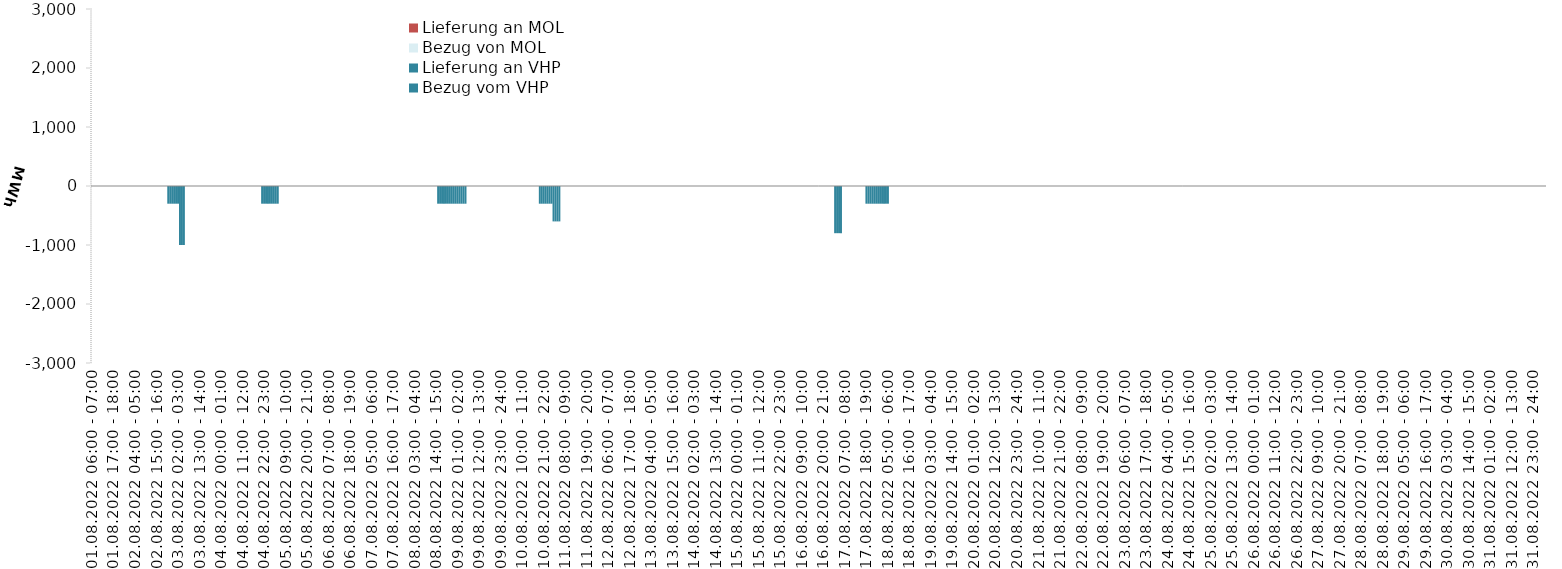
| Category | Bezug vom VHP | Lieferung an VHP | Bezug von MOL | Lieferung an MOL |
|---|---|---|---|---|
| 01.08.2022 06:00 - 07:00 | 0 | 0 | 0 | 0 |
| 01.08.2022 07:00 - 08:00 | 0 | 0 | 0 | 0 |
| 01.08.2022 08:00 - 09:00 | 0 | 0 | 0 | 0 |
| 01.08.2022 09:00 - 10:00 | 0 | 0 | 0 | 0 |
| 01.08.2022 10:00 - 11:00 | 0 | 0 | 0 | 0 |
| 01.08.2022 11:00 - 12:00 | 0 | 0 | 0 | 0 |
| 01.08.2022 12:00 - 13:00 | 0 | 0 | 0 | 0 |
| 01.08.2022 13:00 - 14:00 | 0 | 0 | 0 | 0 |
| 01.08.2022 14:00 - 15:00 | 0 | 0 | 0 | 0 |
| 01.08.2022 15:00 - 16:00 | 0 | 0 | 0 | 0 |
| 01.08.2022 16:00 - 17:00 | 0 | 0 | 0 | 0 |
| 01.08.2022 17:00 - 18:00 | 0 | 0 | 0 | 0 |
| 01.08.2022 18:00 - 19:00 | 0 | 0 | 0 | 0 |
| 01.08.2022 19:00 - 20:00 | 0 | 0 | 0 | 0 |
| 01.08.2022 20:00 - 21:00 | 0 | 0 | 0 | 0 |
| 01.08.2022 21:00 - 22:00 | 0 | 0 | 0 | 0 |
| 01.08.2022 22:00 - 23:00 | 0 | 0 | 0 | 0 |
| 01.08.2022 23:00 - 24:00 | 0 | 0 | 0 | 0 |
| 02.08.2022 00:00 - 01:00 | 0 | 0 | 0 | 0 |
| 02.08.2022 01:00 - 02:00 | 0 | 0 | 0 | 0 |
| 02.08.2022 02:00 - 03:00 | 0 | 0 | 0 | 0 |
| 02.08.2022 03:00 - 04:00 | 0 | 0 | 0 | 0 |
| 02.08.2022 04:00 - 05:00 | 0 | 0 | 0 | 0 |
| 02.08.2022 05:00 - 06:00 | 0 | 0 | 0 | 0 |
| 02.08.2022 06:00 - 07:00 | 0 | 0 | 0 | 0 |
| 02.08.2022 07:00 - 08:00 | 0 | 0 | 0 | 0 |
| 02.08.2022 08:00 - 09:00 | 0 | 0 | 0 | 0 |
| 02.08.2022 09:00 - 10:00 | 0 | 0 | 0 | 0 |
| 02.08.2022 10:00 - 11:00 | 0 | 0 | 0 | 0 |
| 02.08.2022 11:00 - 12:00 | 0 | 0 | 0 | 0 |
| 02.08.2022 12:00 - 13:00 | 0 | 0 | 0 | 0 |
| 02.08.2022 13:00 - 14:00 | 0 | 0 | 0 | 0 |
| 02.08.2022 14:00 - 15:00 | 0 | 0 | 0 | 0 |
| 02.08.2022 15:00 - 16:00 | 0 | 0 | 0 | 0 |
| 02.08.2022 16:00 - 17:00 | 0 | 0 | 0 | 0 |
| 02.08.2022 17:00 - 18:00 | 0 | 0 | 0 | 0 |
| 02.08.2022 18:00 - 19:00 | 0 | 0 | 0 | 0 |
| 02.08.2022 19:00 - 20:00 | 0 | 0 | 0 | 0 |
| 02.08.2022 20:00 - 21:00 | 0 | 0 | 0 | 0 |
| 02.08.2022 21:00 - 22:00 | 0 | -300 | 0 | 0 |
| 02.08.2022 22:00 - 23:00 | 0 | -300 | 0 | 0 |
| 02.08.2022 23:00 - 24:00 | 0 | -300 | 0 | 0 |
| 03.08.2022 00:00 - 01:00 | 0 | -300 | 0 | 0 |
| 03.08.2022 01:00 - 02:00 | 0 | -300 | 0 | 0 |
| 03.08.2022 02:00 - 03:00 | 0 | -300 | 0 | 0 |
| 03.08.2022 03:00 - 04:00 | 0 | -1000 | 0 | 0 |
| 03.08.2022 04:00 - 05:00 | 0 | -1000 | 0 | 0 |
| 03.08.2022 05:00 - 06:00 | 0 | -1000 | 0 | 0 |
| 03.08.2022 06:00 - 07:00 | 0 | 0 | 0 | 0 |
| 03.08.2022 07:00 - 08:00 | 0 | 0 | 0 | 0 |
| 03.08.2022 08:00 - 09:00 | 0 | 0 | 0 | 0 |
| 03.08.2022 09:00 - 10:00 | 0 | 0 | 0 | 0 |
| 03.08.2022 10:00 - 11:00 | 0 | 0 | 0 | 0 |
| 03.08.2022 11:00 - 12:00 | 0 | 0 | 0 | 0 |
| 03.08.2022 12:00 - 13:00 | 0 | 0 | 0 | 0 |
| 03.08.2022 13:00 - 14:00 | 0 | 0 | 0 | 0 |
| 03.08.2022 14:00 - 15:00 | 0 | 0 | 0 | 0 |
| 03.08.2022 15:00 - 16:00 | 0 | 0 | 0 | 0 |
| 03.08.2022 16:00 - 17:00 | 0 | 0 | 0 | 0 |
| 03.08.2022 17:00 - 18:00 | 0 | 0 | 0 | 0 |
| 03.08.2022 18:00 - 19:00 | 0 | 0 | 0 | 0 |
| 03.08.2022 19:00 - 20:00 | 0 | 0 | 0 | 0 |
| 03.08.2022 20:00 - 21:00 | 0 | 0 | 0 | 0 |
| 03.08.2022 21:00 - 22:00 | 0 | 0 | 0 | 0 |
| 03.08.2022 22:00 - 23:00 | 0 | 0 | 0 | 0 |
| 03.08.2022 23:00 - 24:00 | 0 | 0 | 0 | 0 |
| 04.08.2022 00:00 - 01:00 | 0 | 0 | 0 | 0 |
| 04.08.2022 01:00 - 02:00 | 0 | 0 | 0 | 0 |
| 04.08.2022 02:00 - 03:00 | 0 | 0 | 0 | 0 |
| 04.08.2022 03:00 - 04:00 | 0 | 0 | 0 | 0 |
| 04.08.2022 04:00 - 05:00 | 0 | 0 | 0 | 0 |
| 04.08.2022 05:00 - 06:00 | 0 | 0 | 0 | 0 |
| 04.08.2022 06:00 - 07:00 | 0 | 0 | 0 | 0 |
| 04.08.2022 07:00 - 08:00 | 0 | 0 | 0 | 0 |
| 04.08.2022 08:00 - 09:00 | 0 | 0 | 0 | 0 |
| 04.08.2022 09:00 - 10:00 | 0 | 0 | 0 | 0 |
| 04.08.2022 10:00 - 11:00 | 0 | 0 | 0 | 0 |
| 04.08.2022 11:00 - 12:00 | 0 | 0 | 0 | 0 |
| 04.08.2022 12:00 - 13:00 | 0 | 0 | 0 | 0 |
| 04.08.2022 13:00 - 14:00 | 0 | 0 | 0 | 0 |
| 04.08.2022 14:00 - 15:00 | 0 | 0 | 0 | 0 |
| 04.08.2022 15:00 - 16:00 | 0 | 0 | 0 | 0 |
| 04.08.2022 16:00 - 17:00 | 0 | 0 | 0 | 0 |
| 04.08.2022 17:00 - 18:00 | 0 | 0 | 0 | 0 |
| 04.08.2022 18:00 - 19:00 | 0 | 0 | 0 | 0 |
| 04.08.2022 19:00 - 20:00 | 0 | 0 | 0 | 0 |
| 04.08.2022 20:00 - 21:00 | 0 | 0 | 0 | 0 |
| 04.08.2022 21:00 - 22:00 | 0 | -300 | 0 | 0 |
| 04.08.2022 22:00 - 23:00 | 0 | -300 | 0 | 0 |
| 04.08.2022 23:00 - 24:00 | 0 | -300 | 0 | 0 |
| 05.08.2022 00:00 - 01:00 | 0 | -300 | 0 | 0 |
| 05.08.2022 01:00 - 02:00 | 0 | -300 | 0 | 0 |
| 05.08.2022 02:00 - 03:00 | 0 | -300 | 0 | 0 |
| 05.08.2022 03:00 - 04:00 | 0 | -300 | 0 | 0 |
| 05.08.2022 04:00 - 05:00 | 0 | -300 | 0 | 0 |
| 05.08.2022 05:00 - 06:00 | 0 | -300 | 0 | 0 |
| 05.08.2022 06:00 - 07:00 | 0 | 0 | 0 | 0 |
| 05.08.2022 07:00 - 08:00 | 0 | 0 | 0 | 0 |
| 05.08.2022 08:00 - 09:00 | 0 | 0 | 0 | 0 |
| 05.08.2022 09:00 - 10:00 | 0 | 0 | 0 | 0 |
| 05.08.2022 10:00 - 11:00 | 0 | 0 | 0 | 0 |
| 05.08.2022 11:00 - 12:00 | 0 | 0 | 0 | 0 |
| 05.08.2022 12:00 - 13:00 | 0 | 0 | 0 | 0 |
| 05.08.2022 13:00 - 14:00 | 0 | 0 | 0 | 0 |
| 05.08.2022 14:00 - 15:00 | 0 | 0 | 0 | 0 |
| 05.08.2022 15:00 - 16:00 | 0 | 0 | 0 | 0 |
| 05.08.2022 16:00 - 17:00 | 0 | 0 | 0 | 0 |
| 05.08.2022 17:00 - 18:00 | 0 | 0 | 0 | 0 |
| 05.08.2022 18:00 - 19:00 | 0 | 0 | 0 | 0 |
| 05.08.2022 19:00 - 20:00 | 0 | 0 | 0 | 0 |
| 05.08.2022 20:00 - 21:00 | 0 | 0 | 0 | 0 |
| 05.08.2022 21:00 - 22:00 | 0 | 0 | 0 | 0 |
| 05.08.2022 22:00 - 23:00 | 0 | 0 | 0 | 0 |
| 05.08.2022 23:00 - 24:00 | 0 | 0 | 0 | 0 |
| 06.08.2022 00:00 - 01:00 | 0 | 0 | 0 | 0 |
| 06.08.2022 01:00 - 02:00 | 0 | 0 | 0 | 0 |
| 06.08.2022 02:00 - 03:00 | 0 | 0 | 0 | 0 |
| 06.08.2022 03:00 - 04:00 | 0 | 0 | 0 | 0 |
| 06.08.2022 04:00 - 05:00 | 0 | 0 | 0 | 0 |
| 06.08.2022 05:00 - 06:00 | 0 | 0 | 0 | 0 |
| 06.08.2022 06:00 - 07:00 | 0 | 0 | 0 | 0 |
| 06.08.2022 07:00 - 08:00 | 0 | 0 | 0 | 0 |
| 06.08.2022 08:00 - 09:00 | 0 | 0 | 0 | 0 |
| 06.08.2022 09:00 - 10:00 | 0 | 0 | 0 | 0 |
| 06.08.2022 10:00 - 11:00 | 0 | 0 | 0 | 0 |
| 06.08.2022 11:00 - 12:00 | 0 | 0 | 0 | 0 |
| 06.08.2022 12:00 - 13:00 | 0 | 0 | 0 | 0 |
| 06.08.2022 13:00 - 14:00 | 0 | 0 | 0 | 0 |
| 06.08.2022 14:00 - 15:00 | 0 | 0 | 0 | 0 |
| 06.08.2022 15:00 - 16:00 | 0 | 0 | 0 | 0 |
| 06.08.2022 16:00 - 17:00 | 0 | 0 | 0 | 0 |
| 06.08.2022 17:00 - 18:00 | 0 | 0 | 0 | 0 |
| 06.08.2022 18:00 - 19:00 | 0 | 0 | 0 | 0 |
| 06.08.2022 19:00 - 20:00 | 0 | 0 | 0 | 0 |
| 06.08.2022 20:00 - 21:00 | 0 | 0 | 0 | 0 |
| 06.08.2022 21:00 - 22:00 | 0 | 0 | 0 | 0 |
| 06.08.2022 22:00 - 23:00 | 0 | 0 | 0 | 0 |
| 06.08.2022 23:00 - 24:00 | 0 | 0 | 0 | 0 |
| 07.08.2022 00:00 - 01:00 | 0 | 0 | 0 | 0 |
| 07.08.2022 01:00 - 02:00 | 0 | 0 | 0 | 0 |
| 07.08.2022 02:00 - 03:00 | 0 | 0 | 0 | 0 |
| 07.08.2022 03:00 - 04:00 | 0 | 0 | 0 | 0 |
| 07.08.2022 04:00 - 05:00 | 0 | 0 | 0 | 0 |
| 07.08.2022 05:00 - 06:00 | 0 | 0 | 0 | 0 |
| 07.08.2022 06:00 - 07:00 | 0 | 0 | 0 | 0 |
| 07.08.2022 07:00 - 08:00 | 0 | 0 | 0 | 0 |
| 07.08.2022 08:00 - 09:00 | 0 | 0 | 0 | 0 |
| 07.08.2022 09:00 - 10:00 | 0 | 0 | 0 | 0 |
| 07.08.2022 10:00 - 11:00 | 0 | 0 | 0 | 0 |
| 07.08.2022 11:00 - 12:00 | 0 | 0 | 0 | 0 |
| 07.08.2022 12:00 - 13:00 | 0 | 0 | 0 | 0 |
| 07.08.2022 13:00 - 14:00 | 0 | 0 | 0 | 0 |
| 07.08.2022 14:00 - 15:00 | 0 | 0 | 0 | 0 |
| 07.08.2022 15:00 - 16:00 | 0 | 0 | 0 | 0 |
| 07.08.2022 16:00 - 17:00 | 0 | 0 | 0 | 0 |
| 07.08.2022 17:00 - 18:00 | 0 | 0 | 0 | 0 |
| 07.08.2022 18:00 - 19:00 | 0 | 0 | 0 | 0 |
| 07.08.2022 19:00 - 20:00 | 0 | 0 | 0 | 0 |
| 07.08.2022 20:00 - 21:00 | 0 | 0 | 0 | 0 |
| 07.08.2022 21:00 - 22:00 | 0 | 0 | 0 | 0 |
| 07.08.2022 22:00 - 23:00 | 0 | 0 | 0 | 0 |
| 07.08.2022 23:00 - 24:00 | 0 | 0 | 0 | 0 |
| 08.08.2022 00:00 - 01:00 | 0 | 0 | 0 | 0 |
| 08.08.2022 01:00 - 02:00 | 0 | 0 | 0 | 0 |
| 08.08.2022 02:00 - 03:00 | 0 | 0 | 0 | 0 |
| 08.08.2022 03:00 - 04:00 | 0 | 0 | 0 | 0 |
| 08.08.2022 04:00 - 05:00 | 0 | 0 | 0 | 0 |
| 08.08.2022 05:00 - 06:00 | 0 | 0 | 0 | 0 |
| 08.08.2022 06:00 - 07:00 | 0 | 0 | 0 | 0 |
| 08.08.2022 07:00 - 08:00 | 0 | 0 | 0 | 0 |
| 08.08.2022 08:00 - 09:00 | 0 | 0 | 0 | 0 |
| 08.08.2022 09:00 - 10:00 | 0 | 0 | 0 | 0 |
| 08.08.2022 10:00 - 11:00 | 0 | 0 | 0 | 0 |
| 08.08.2022 11:00 - 12:00 | 0 | 0 | 0 | 0 |
| 08.08.2022 12:00 - 13:00 | 0 | 0 | 0 | 0 |
| 08.08.2022 13:00 - 14:00 | 0 | 0 | 0 | 0 |
| 08.08.2022 14:00 - 15:00 | 0 | 0 | 0 | 0 |
| 08.08.2022 15:00 - 16:00 | 0 | -300 | 0 | 0 |
| 08.08.2022 16:00 - 17:00 | 0 | -300 | 0 | 0 |
| 08.08.2022 17:00 - 18:00 | 0 | -300 | 0 | 0 |
| 08.08.2022 18:00 - 19:00 | 0 | -300 | 0 | 0 |
| 08.08.2022 19:00 - 20:00 | 0 | -300 | 0 | 0 |
| 08.08.2022 20:00 - 21:00 | 0 | -300 | 0 | 0 |
| 08.08.2022 21:00 - 22:00 | 0 | -300 | 0 | 0 |
| 08.08.2022 22:00 - 23:00 | 0 | -300 | 0 | 0 |
| 08.08.2022 23:00 - 24:00 | 0 | -300 | 0 | 0 |
| 09.08.2022 00:00 - 01:00 | 0 | -300 | 0 | 0 |
| 09.08.2022 01:00 - 02:00 | 0 | -300 | 0 | 0 |
| 09.08.2022 02:00 - 03:00 | 0 | -300 | 0 | 0 |
| 09.08.2022 03:00 - 04:00 | 0 | -300 | 0 | 0 |
| 09.08.2022 04:00 - 05:00 | 0 | -300 | 0 | 0 |
| 09.08.2022 05:00 - 06:00 | 0 | -300 | 0 | 0 |
| 09.08.2022 06:00 - 07:00 | 0 | 0 | 0 | 0 |
| 09.08.2022 07:00 - 08:00 | 0 | 0 | 0 | 0 |
| 09.08.2022 08:00 - 09:00 | 0 | 0 | 0 | 0 |
| 09.08.2022 09:00 - 10:00 | 0 | 0 | 0 | 0 |
| 09.08.2022 10:00 - 11:00 | 0 | 0 | 0 | 0 |
| 09.08.2022 11:00 - 12:00 | 0 | 0 | 0 | 0 |
| 09.08.2022 12:00 - 13:00 | 0 | 0 | 0 | 0 |
| 09.08.2022 13:00 - 14:00 | 0 | 0 | 0 | 0 |
| 09.08.2022 14:00 - 15:00 | 0 | 0 | 0 | 0 |
| 09.08.2022 15:00 - 16:00 | 0 | 0 | 0 | 0 |
| 09.08.2022 16:00 - 17:00 | 0 | 0 | 0 | 0 |
| 09.08.2022 17:00 - 18:00 | 0 | 0 | 0 | 0 |
| 09.08.2022 18:00 - 19:00 | 0 | 0 | 0 | 0 |
| 09.08.2022 19:00 - 20:00 | 0 | 0 | 0 | 0 |
| 09.08.2022 20:00 - 21:00 | 0 | 0 | 0 | 0 |
| 09.08.2022 21:00 - 22:00 | 0 | 0 | 0 | 0 |
| 09.08.2022 22:00 - 23:00 | 0 | 0 | 0 | 0 |
| 09.08.2022 23:00 - 24:00 | 0 | 0 | 0 | 0 |
| 10.08.2022 00:00 - 01:00 | 0 | 0 | 0 | 0 |
| 10.08.2022 01:00 - 02:00 | 0 | 0 | 0 | 0 |
| 10.08.2022 02:00 - 03:00 | 0 | 0 | 0 | 0 |
| 10.08.2022 03:00 - 04:00 | 0 | 0 | 0 | 0 |
| 10.08.2022 04:00 - 05:00 | 0 | 0 | 0 | 0 |
| 10.08.2022 05:00 - 06:00 | 0 | 0 | 0 | 0 |
| 10.08.2022 06:00 - 07:00 | 0 | 0 | 0 | 0 |
| 10.08.2022 07:00 - 08:00 | 0 | 0 | 0 | 0 |
| 10.08.2022 08:00 - 09:00 | 0 | 0 | 0 | 0 |
| 10.08.2022 09:00 - 10:00 | 0 | 0 | 0 | 0 |
| 10.08.2022 10:00 - 11:00 | 0 | 0 | 0 | 0 |
| 10.08.2022 11:00 - 12:00 | 0 | 0 | 0 | 0 |
| 10.08.2022 12:00 - 13:00 | 0 | 0 | 0 | 0 |
| 10.08.2022 13:00 - 14:00 | 0 | 0 | 0 | 0 |
| 10.08.2022 14:00 - 15:00 | 0 | 0 | 0 | 0 |
| 10.08.2022 15:00 - 16:00 | 0 | 0 | 0 | 0 |
| 10.08.2022 16:00 - 17:00 | 0 | 0 | 0 | 0 |
| 10.08.2022 17:00 - 18:00 | 0 | 0 | 0 | 0 |
| 10.08.2022 18:00 - 19:00 | 0 | 0 | 0 | 0 |
| 10.08.2022 19:00 - 20:00 | 0 | -300 | 0 | 0 |
| 10.08.2022 20:00 - 21:00 | 0 | -300 | 0 | 0 |
| 10.08.2022 21:00 - 22:00 | 0 | -300 | 0 | 0 |
| 10.08.2022 22:00 - 23:00 | 0 | -300 | 0 | 0 |
| 10.08.2022 23:00 - 24:00 | 0 | -300 | 0 | 0 |
| 11.08.2022 00:00 - 01:00 | 0 | -300 | 0 | 0 |
| 11.08.2022 01:00 - 02:00 | 0 | -300 | 0 | 0 |
| 11.08.2022 02:00 - 03:00 | 0 | -600 | 0 | 0 |
| 11.08.2022 03:00 - 04:00 | 0 | -600 | 0 | 0 |
| 11.08.2022 04:00 - 05:00 | 0 | -600 | 0 | 0 |
| 11.08.2022 05:00 - 06:00 | 0 | -600 | 0 | 0 |
| 11.08.2022 06:00 - 07:00 | 0 | 0 | 0 | 0 |
| 11.08.2022 07:00 - 08:00 | 0 | 0 | 0 | 0 |
| 11.08.2022 08:00 - 09:00 | 0 | 0 | 0 | 0 |
| 11.08.2022 09:00 - 10:00 | 0 | 0 | 0 | 0 |
| 11.08.2022 10:00 - 11:00 | 0 | 0 | 0 | 0 |
| 11.08.2022 11:00 - 12:00 | 0 | 0 | 0 | 0 |
| 11.08.2022 12:00 - 13:00 | 0 | 0 | 0 | 0 |
| 11.08.2022 13:00 - 14:00 | 0 | 0 | 0 | 0 |
| 11.08.2022 14:00 - 15:00 | 0 | 0 | 0 | 0 |
| 11.08.2022 15:00 - 16:00 | 0 | 0 | 0 | 0 |
| 11.08.2022 16:00 - 17:00 | 0 | 0 | 0 | 0 |
| 11.08.2022 17:00 - 18:00 | 0 | 0 | 0 | 0 |
| 11.08.2022 18:00 - 19:00 | 0 | 0 | 0 | 0 |
| 11.08.2022 19:00 - 20:00 | 0 | 0 | 0 | 0 |
| 11.08.2022 20:00 - 21:00 | 0 | 0 | 0 | 0 |
| 11.08.2022 21:00 - 22:00 | 0 | 0 | 0 | 0 |
| 11.08.2022 22:00 - 23:00 | 0 | 0 | 0 | 0 |
| 11.08.2022 23:00 - 24:00 | 0 | 0 | 0 | 0 |
| 12.08.2022 00:00 - 01:00 | 0 | 0 | 0 | 0 |
| 12.08.2022 01:00 - 02:00 | 0 | 0 | 0 | 0 |
| 12.08.2022 02:00 - 03:00 | 0 | 0 | 0 | 0 |
| 12.08.2022 03:00 - 04:00 | 0 | 0 | 0 | 0 |
| 12.08.2022 04:00 - 05:00 | 0 | 0 | 0 | 0 |
| 12.08.2022 05:00 - 06:00 | 0 | 0 | 0 | 0 |
| 12.08.2022 06:00 - 07:00 | 0 | 0 | 0 | 0 |
| 12.08.2022 07:00 - 08:00 | 0 | 0 | 0 | 0 |
| 12.08.2022 08:00 - 09:00 | 0 | 0 | 0 | 0 |
| 12.08.2022 09:00 - 10:00 | 0 | 0 | 0 | 0 |
| 12.08.2022 10:00 - 11:00 | 0 | 0 | 0 | 0 |
| 12.08.2022 11:00 - 12:00 | 0 | 0 | 0 | 0 |
| 12.08.2022 12:00 - 13:00 | 0 | 0 | 0 | 0 |
| 12.08.2022 13:00 - 14:00 | 0 | 0 | 0 | 0 |
| 12.08.2022 14:00 - 15:00 | 0 | 0 | 0 | 0 |
| 12.08.2022 15:00 - 16:00 | 0 | 0 | 0 | 0 |
| 12.08.2022 16:00 - 17:00 | 0 | 0 | 0 | 0 |
| 12.08.2022 17:00 - 18:00 | 0 | 0 | 0 | 0 |
| 12.08.2022 18:00 - 19:00 | 0 | 0 | 0 | 0 |
| 12.08.2022 19:00 - 20:00 | 0 | 0 | 0 | 0 |
| 12.08.2022 20:00 - 21:00 | 0 | 0 | 0 | 0 |
| 12.08.2022 21:00 - 22:00 | 0 | 0 | 0 | 0 |
| 12.08.2022 22:00 - 23:00 | 0 | 0 | 0 | 0 |
| 12.08.2022 23:00 - 24:00 | 0 | 0 | 0 | 0 |
| 13.08.2022 00:00 - 01:00 | 0 | 0 | 0 | 0 |
| 13.08.2022 01:00 - 02:00 | 0 | 0 | 0 | 0 |
| 13.08.2022 02:00 - 03:00 | 0 | 0 | 0 | 0 |
| 13.08.2022 03:00 - 04:00 | 0 | 0 | 0 | 0 |
| 13.08.2022 04:00 - 05:00 | 0 | 0 | 0 | 0 |
| 13.08.2022 05:00 - 06:00 | 0 | 0 | 0 | 0 |
| 13.08.2022 06:00 - 07:00 | 0 | 0 | 0 | 0 |
| 13.08.2022 07:00 - 08:00 | 0 | 0 | 0 | 0 |
| 13.08.2022 08:00 - 09:00 | 0 | 0 | 0 | 0 |
| 13.08.2022 09:00 - 10:00 | 0 | 0 | 0 | 0 |
| 13.08.2022 10:00 - 11:00 | 0 | 0 | 0 | 0 |
| 13.08.2022 11:00 - 12:00 | 0 | 0 | 0 | 0 |
| 13.08.2022 12:00 - 13:00 | 0 | 0 | 0 | 0 |
| 13.08.2022 13:00 - 14:00 | 0 | 0 | 0 | 0 |
| 13.08.2022 14:00 - 15:00 | 0 | 0 | 0 | 0 |
| 13.08.2022 15:00 - 16:00 | 0 | 0 | 0 | 0 |
| 13.08.2022 16:00 - 17:00 | 0 | 0 | 0 | 0 |
| 13.08.2022 17:00 - 18:00 | 0 | 0 | 0 | 0 |
| 13.08.2022 18:00 - 19:00 | 0 | 0 | 0 | 0 |
| 13.08.2022 19:00 - 20:00 | 0 | 0 | 0 | 0 |
| 13.08.2022 20:00 - 21:00 | 0 | 0 | 0 | 0 |
| 13.08.2022 21:00 - 22:00 | 0 | 0 | 0 | 0 |
| 13.08.2022 22:00 - 23:00 | 0 | 0 | 0 | 0 |
| 13.08.2022 23:00 - 24:00 | 0 | 0 | 0 | 0 |
| 14.08.2022 00:00 - 01:00 | 0 | 0 | 0 | 0 |
| 14.08.2022 01:00 - 02:00 | 0 | 0 | 0 | 0 |
| 14.08.2022 02:00 - 03:00 | 0 | 0 | 0 | 0 |
| 14.08.2022 03:00 - 04:00 | 0 | 0 | 0 | 0 |
| 14.08.2022 04:00 - 05:00 | 0 | 0 | 0 | 0 |
| 14.08.2022 05:00 - 06:00 | 0 | 0 | 0 | 0 |
| 14.08.2022 06:00 - 07:00 | 0 | 0 | 0 | 0 |
| 14.08.2022 07:00 - 08:00 | 0 | 0 | 0 | 0 |
| 14.08.2022 08:00 - 09:00 | 0 | 0 | 0 | 0 |
| 14.08.2022 09:00 - 10:00 | 0 | 0 | 0 | 0 |
| 14.08.2022 10:00 - 11:00 | 0 | 0 | 0 | 0 |
| 14.08.2022 11:00 - 12:00 | 0 | 0 | 0 | 0 |
| 14.08.2022 12:00 - 13:00 | 0 | 0 | 0 | 0 |
| 14.08.2022 13:00 - 14:00 | 0 | 0 | 0 | 0 |
| 14.08.2022 14:00 - 15:00 | 0 | 0 | 0 | 0 |
| 14.08.2022 15:00 - 16:00 | 0 | 0 | 0 | 0 |
| 14.08.2022 16:00 - 17:00 | 0 | 0 | 0 | 0 |
| 14.08.2022 17:00 - 18:00 | 0 | 0 | 0 | 0 |
| 14.08.2022 18:00 - 19:00 | 0 | 0 | 0 | 0 |
| 14.08.2022 19:00 - 20:00 | 0 | 0 | 0 | 0 |
| 14.08.2022 20:00 - 21:00 | 0 | 0 | 0 | 0 |
| 14.08.2022 21:00 - 22:00 | 0 | 0 | 0 | 0 |
| 14.08.2022 22:00 - 23:00 | 0 | 0 | 0 | 0 |
| 14.08.2022 23:00 - 24:00 | 0 | 0 | 0 | 0 |
| 15.08.2022 00:00 - 01:00 | 0 | 0 | 0 | 0 |
| 15.08.2022 01:00 - 02:00 | 0 | 0 | 0 | 0 |
| 15.08.2022 02:00 - 03:00 | 0 | 0 | 0 | 0 |
| 15.08.2022 03:00 - 04:00 | 0 | 0 | 0 | 0 |
| 15.08.2022 04:00 - 05:00 | 0 | 0 | 0 | 0 |
| 15.08.2022 05:00 - 06:00 | 0 | 0 | 0 | 0 |
| 15.08.2022 06:00 - 07:00 | 0 | 0 | 0 | 0 |
| 15.08.2022 07:00 - 08:00 | 0 | 0 | 0 | 0 |
| 15.08.2022 08:00 - 09:00 | 0 | 0 | 0 | 0 |
| 15.08.2022 09:00 - 10:00 | 0 | 0 | 0 | 0 |
| 15.08.2022 10:00 - 11:00 | 0 | 0 | 0 | 0 |
| 15.08.2022 11:00 - 12:00 | 0 | 0 | 0 | 0 |
| 15.08.2022 12:00 - 13:00 | 0 | 0 | 0 | 0 |
| 15.08.2022 13:00 - 14:00 | 0 | 0 | 0 | 0 |
| 15.08.2022 14:00 - 15:00 | 0 | 0 | 0 | 0 |
| 15.08.2022 15:00 - 16:00 | 0 | 0 | 0 | 0 |
| 15.08.2022 16:00 - 17:00 | 0 | 0 | 0 | 0 |
| 15.08.2022 17:00 - 18:00 | 0 | 0 | 0 | 0 |
| 15.08.2022 18:00 - 19:00 | 0 | 0 | 0 | 0 |
| 15.08.2022 19:00 - 20:00 | 0 | 0 | 0 | 0 |
| 15.08.2022 20:00 - 21:00 | 0 | 0 | 0 | 0 |
| 15.08.2022 21:00 - 22:00 | 0 | 0 | 0 | 0 |
| 15.08.2022 22:00 - 23:00 | 0 | 0 | 0 | 0 |
| 15.08.2022 23:00 - 24:00 | 0 | 0 | 0 | 0 |
| 16.08.2022 00:00 - 01:00 | 0 | 0 | 0 | 0 |
| 16.08.2022 01:00 - 02:00 | 0 | 0 | 0 | 0 |
| 16.08.2022 02:00 - 03:00 | 0 | 0 | 0 | 0 |
| 16.08.2022 03:00 - 04:00 | 0 | 0 | 0 | 0 |
| 16.08.2022 04:00 - 05:00 | 0 | 0 | 0 | 0 |
| 16.08.2022 05:00 - 06:00 | 0 | 0 | 0 | 0 |
| 16.08.2022 06:00 - 07:00 | 0 | 0 | 0 | 0 |
| 16.08.2022 07:00 - 08:00 | 0 | 0 | 0 | 0 |
| 16.08.2022 08:00 - 09:00 | 0 | 0 | 0 | 0 |
| 16.08.2022 09:00 - 10:00 | 0 | 0 | 0 | 0 |
| 16.08.2022 10:00 - 11:00 | 0 | 0 | 0 | 0 |
| 16.08.2022 11:00 - 12:00 | 0 | 0 | 0 | 0 |
| 16.08.2022 12:00 - 13:00 | 0 | 0 | 0 | 0 |
| 16.08.2022 13:00 - 14:00 | 0 | 0 | 0 | 0 |
| 16.08.2022 14:00 - 15:00 | 0 | 0 | 0 | 0 |
| 16.08.2022 15:00 - 16:00 | 0 | 0 | 0 | 0 |
| 16.08.2022 16:00 - 17:00 | 0 | 0 | 0 | 0 |
| 16.08.2022 17:00 - 18:00 | 0 | 0 | 0 | 0 |
| 16.08.2022 18:00 - 19:00 | 0 | 0 | 0 | 0 |
| 16.08.2022 19:00 - 20:00 | 0 | 0 | 0 | 0 |
| 16.08.2022 20:00 - 21:00 | 0 | 0 | 0 | 0 |
| 16.08.2022 21:00 - 22:00 | 0 | 0 | 0 | 0 |
| 16.08.2022 22:00 - 23:00 | 0 | 0 | 0 | 0 |
| 16.08.2022 23:00 - 24:00 | 0 | 0 | 0 | 0 |
| 17.08.2022 00:00 - 01:00 | 0 | 0 | 0 | 0 |
| 17.08.2022 01:00 - 02:00 | 0 | 0 | 0 | 0 |
| 17.08.2022 02:00 - 03:00 | 0 | -800 | 0 | 0 |
| 17.08.2022 03:00 - 04:00 | 0 | -800 | 0 | 0 |
| 17.08.2022 04:00 - 05:00 | 0 | -800 | 0 | 0 |
| 17.08.2022 05:00 - 06:00 | 0 | -800 | 0 | 0 |
| 17.08.2022 06:00 - 07:00 | 0 | 0 | 0 | 0 |
| 17.08.2022 07:00 - 08:00 | 0 | 0 | 0 | 0 |
| 17.08.2022 08:00 - 09:00 | 0 | 0 | 0 | 0 |
| 17.08.2022 09:00 - 10:00 | 0 | 0 | 0 | 0 |
| 17.08.2022 10:00 - 11:00 | 0 | 0 | 0 | 0 |
| 17.08.2022 11:00 - 12:00 | 0 | 0 | 0 | 0 |
| 17.08.2022 12:00 - 13:00 | 0 | 0 | 0 | 0 |
| 17.08.2022 13:00 - 14:00 | 0 | 0 | 0 | 0 |
| 17.08.2022 14:00 - 15:00 | 0 | 0 | 0 | 0 |
| 17.08.2022 15:00 - 16:00 | 0 | 0 | 0 | 0 |
| 17.08.2022 16:00 - 17:00 | 0 | 0 | 0 | 0 |
| 17.08.2022 17:00 - 18:00 | 0 | 0 | 0 | 0 |
| 17.08.2022 18:00 - 19:00 | 0 | -300 | 0 | 0 |
| 17.08.2022 19:00 - 20:00 | 0 | -300 | 0 | 0 |
| 17.08.2022 20:00 - 21:00 | 0 | -300 | 0 | 0 |
| 17.08.2022 21:00 - 22:00 | 0 | -300 | 0 | 0 |
| 17.08.2022 22:00 - 23:00 | 0 | -300 | 0 | 0 |
| 17.08.2022 23:00 - 24:00 | 0 | -300 | 0 | 0 |
| 18.08.2022 00:00 - 01:00 | 0 | -300 | 0 | 0 |
| 18.08.2022 01:00 - 02:00 | 0 | -300 | 0 | 0 |
| 18.08.2022 02:00 - 03:00 | 0 | -300 | 0 | 0 |
| 18.08.2022 03:00 - 04:00 | 0 | -300 | 0 | 0 |
| 18.08.2022 04:00 - 05:00 | 0 | -300 | 0 | 0 |
| 18.08.2022 05:00 - 06:00 | 0 | -300 | 0 | 0 |
| 18.08.2022 06:00 - 07:00 | 0 | 0 | 0 | 0 |
| 18.08.2022 07:00 - 08:00 | 0 | 0 | 0 | 0 |
| 18.08.2022 08:00 - 09:00 | 0 | 0 | 0 | 0 |
| 18.08.2022 09:00 - 10:00 | 0 | 0 | 0 | 0 |
| 18.08.2022 10:00 - 11:00 | 0 | 0 | 0 | 0 |
| 18.08.2022 11:00 - 12:00 | 0 | 0 | 0 | 0 |
| 18.08.2022 12:00 - 13:00 | 0 | 0 | 0 | 0 |
| 18.08.2022 13:00 - 14:00 | 0 | 0 | 0 | 0 |
| 18.08.2022 14:00 - 15:00 | 0 | 0 | 0 | 0 |
| 18.08.2022 15:00 - 16:00 | 0 | 0 | 0 | 0 |
| 18.08.2022 16:00 - 17:00 | 0 | 0 | 0 | 0 |
| 18.08.2022 17:00 - 18:00 | 0 | 0 | 0 | 0 |
| 18.08.2022 18:00 - 19:00 | 0 | 0 | 0 | 0 |
| 18.08.2022 19:00 - 20:00 | 0 | 0 | 0 | 0 |
| 18.08.2022 20:00 - 21:00 | 0 | 0 | 0 | 0 |
| 18.08.2022 21:00 - 22:00 | 0 | 0 | 0 | 0 |
| 18.08.2022 22:00 - 23:00 | 0 | 0 | 0 | 0 |
| 18.08.2022 23:00 - 24:00 | 0 | 0 | 0 | 0 |
| 19.08.2022 00:00 - 01:00 | 0 | 0 | 0 | 0 |
| 19.08.2022 01:00 - 02:00 | 0 | 0 | 0 | 0 |
| 19.08.2022 02:00 - 03:00 | 0 | 0 | 0 | 0 |
| 19.08.2022 03:00 - 04:00 | 0 | 0 | 0 | 0 |
| 19.08.2022 04:00 - 05:00 | 0 | 0 | 0 | 0 |
| 19.08.2022 05:00 - 06:00 | 0 | 0 | 0 | 0 |
| 19.08.2022 06:00 - 07:00 | 0 | 0 | 0 | 0 |
| 19.08.2022 07:00 - 08:00 | 0 | 0 | 0 | 0 |
| 19.08.2022 08:00 - 09:00 | 0 | 0 | 0 | 0 |
| 19.08.2022 09:00 - 10:00 | 0 | 0 | 0 | 0 |
| 19.08.2022 10:00 - 11:00 | 0 | 0 | 0 | 0 |
| 19.08.2022 11:00 - 12:00 | 0 | 0 | 0 | 0 |
| 19.08.2022 12:00 - 13:00 | 0 | 0 | 0 | 0 |
| 19.08.2022 13:00 - 14:00 | 0 | 0 | 0 | 0 |
| 19.08.2022 14:00 - 15:00 | 0 | 0 | 0 | 0 |
| 19.08.2022 15:00 - 16:00 | 0 | 0 | 0 | 0 |
| 19.08.2022 16:00 - 17:00 | 0 | 0 | 0 | 0 |
| 19.08.2022 17:00 - 18:00 | 0 | 0 | 0 | 0 |
| 19.08.2022 18:00 - 19:00 | 0 | 0 | 0 | 0 |
| 19.08.2022 19:00 - 20:00 | 0 | 0 | 0 | 0 |
| 19.08.2022 20:00 - 21:00 | 0 | 0 | 0 | 0 |
| 19.08.2022 21:00 - 22:00 | 0 | 0 | 0 | 0 |
| 19.08.2022 22:00 - 23:00 | 0 | 0 | 0 | 0 |
| 19.08.2022 23:00 - 24:00 | 0 | 0 | 0 | 0 |
| 20.08.2022 00:00 - 01:00 | 0 | 0 | 0 | 0 |
| 20.08.2022 01:00 - 02:00 | 0 | 0 | 0 | 0 |
| 20.08.2022 02:00 - 03:00 | 0 | 0 | 0 | 0 |
| 20.08.2022 03:00 - 04:00 | 0 | 0 | 0 | 0 |
| 20.08.2022 04:00 - 05:00 | 0 | 0 | 0 | 0 |
| 20.08.2022 05:00 - 06:00 | 0 | 0 | 0 | 0 |
| 20.08.2022 06:00 - 07:00 | 0 | 0 | 0 | 0 |
| 20.08.2022 07:00 - 08:00 | 0 | 0 | 0 | 0 |
| 20.08.2022 08:00 - 09:00 | 0 | 0 | 0 | 0 |
| 20.08.2022 09:00 - 10:00 | 0 | 0 | 0 | 0 |
| 20.08.2022 10:00 - 11:00 | 0 | 0 | 0 | 0 |
| 20.08.2022 11:00 - 12:00 | 0 | 0 | 0 | 0 |
| 20.08.2022 12:00 - 13:00 | 0 | 0 | 0 | 0 |
| 20.08.2022 13:00 - 14:00 | 0 | 0 | 0 | 0 |
| 20.08.2022 14:00 - 15:00 | 0 | 0 | 0 | 0 |
| 20.08.2022 15:00 - 16:00 | 0 | 0 | 0 | 0 |
| 20.08.2022 16:00 - 17:00 | 0 | 0 | 0 | 0 |
| 20.08.2022 17:00 - 18:00 | 0 | 0 | 0 | 0 |
| 20.08.2022 18:00 - 19:00 | 0 | 0 | 0 | 0 |
| 20.08.2022 19:00 - 20:00 | 0 | 0 | 0 | 0 |
| 20.08.2022 20:00 - 21:00 | 0 | 0 | 0 | 0 |
| 20.08.2022 21:00 - 22:00 | 0 | 0 | 0 | 0 |
| 20.08.2022 22:00 - 23:00 | 0 | 0 | 0 | 0 |
| 20.08.2022 23:00 - 24:00 | 0 | 0 | 0 | 0 |
| 21.08.2022 00:00 - 01:00 | 0 | 0 | 0 | 0 |
| 21.08.2022 01:00 - 02:00 | 0 | 0 | 0 | 0 |
| 21.08.2022 02:00 - 03:00 | 0 | 0 | 0 | 0 |
| 21.08.2022 03:00 - 04:00 | 0 | 0 | 0 | 0 |
| 21.08.2022 04:00 - 05:00 | 0 | 0 | 0 | 0 |
| 21.08.2022 05:00 - 06:00 | 0 | 0 | 0 | 0 |
| 21.08.2022 06:00 - 07:00 | 0 | 0 | 0 | 0 |
| 21.08.2022 07:00 - 08:00 | 0 | 0 | 0 | 0 |
| 21.08.2022 08:00 - 09:00 | 0 | 0 | 0 | 0 |
| 21.08.2022 09:00 - 10:00 | 0 | 0 | 0 | 0 |
| 21.08.2022 10:00 - 11:00 | 0 | 0 | 0 | 0 |
| 21.08.2022 11:00 - 12:00 | 0 | 0 | 0 | 0 |
| 21.08.2022 12:00 - 13:00 | 0 | 0 | 0 | 0 |
| 21.08.2022 13:00 - 14:00 | 0 | 0 | 0 | 0 |
| 21.08.2022 14:00 - 15:00 | 0 | 0 | 0 | 0 |
| 21.08.2022 15:00 - 16:00 | 0 | 0 | 0 | 0 |
| 21.08.2022 16:00 - 17:00 | 0 | 0 | 0 | 0 |
| 21.08.2022 17:00 - 18:00 | 0 | 0 | 0 | 0 |
| 21.08.2022 18:00 - 19:00 | 0 | 0 | 0 | 0 |
| 21.08.2022 19:00 - 20:00 | 0 | 0 | 0 | 0 |
| 21.08.2022 20:00 - 21:00 | 0 | 0 | 0 | 0 |
| 21.08.2022 21:00 - 22:00 | 0 | 0 | 0 | 0 |
| 21.08.2022 22:00 - 23:00 | 0 | 0 | 0 | 0 |
| 21.08.2022 23:00 - 24:00 | 0 | 0 | 0 | 0 |
| 22.08.2022 00:00 - 01:00 | 0 | 0 | 0 | 0 |
| 22.08.2022 01:00 - 02:00 | 0 | 0 | 0 | 0 |
| 22.08.2022 02:00 - 03:00 | 0 | 0 | 0 | 0 |
| 22.08.2022 03:00 - 04:00 | 0 | 0 | 0 | 0 |
| 22.08.2022 04:00 - 05:00 | 0 | 0 | 0 | 0 |
| 22.08.2022 05:00 - 06:00 | 0 | 0 | 0 | 0 |
| 22.08.2022 06:00 - 07:00 | 0 | 0 | 0 | 0 |
| 22.08.2022 07:00 - 08:00 | 0 | 0 | 0 | 0 |
| 22.08.2022 08:00 - 09:00 | 0 | 0 | 0 | 0 |
| 22.08.2022 09:00 - 10:00 | 0 | 0 | 0 | 0 |
| 22.08.2022 10:00 - 11:00 | 0 | 0 | 0 | 0 |
| 22.08.2022 11:00 - 12:00 | 0 | 0 | 0 | 0 |
| 22.08.2022 12:00 - 13:00 | 0 | 0 | 0 | 0 |
| 22.08.2022 13:00 - 14:00 | 0 | 0 | 0 | 0 |
| 22.08.2022 14:00 - 15:00 | 0 | 0 | 0 | 0 |
| 22.08.2022 15:00 - 16:00 | 0 | 0 | 0 | 0 |
| 22.08.2022 16:00 - 17:00 | 0 | 0 | 0 | 0 |
| 22.08.2022 17:00 - 18:00 | 0 | 0 | 0 | 0 |
| 22.08.2022 18:00 - 19:00 | 0 | 0 | 0 | 0 |
| 22.08.2022 19:00 - 20:00 | 0 | 0 | 0 | 0 |
| 22.08.2022 20:00 - 21:00 | 0 | 0 | 0 | 0 |
| 22.08.2022 21:00 - 22:00 | 0 | 0 | 0 | 0 |
| 22.08.2022 22:00 - 23:00 | 0 | 0 | 0 | 0 |
| 22.08.2022 23:00 - 24:00 | 0 | 0 | 0 | 0 |
| 23.08.2022 00:00 - 01:00 | 0 | 0 | 0 | 0 |
| 23.08.2022 01:00 - 02:00 | 0 | 0 | 0 | 0 |
| 23.08.2022 02:00 - 03:00 | 0 | 0 | 0 | 0 |
| 23.08.2022 03:00 - 04:00 | 0 | 0 | 0 | 0 |
| 23.08.2022 04:00 - 05:00 | 0 | 0 | 0 | 0 |
| 23.08.2022 05:00 - 06:00 | 0 | 0 | 0 | 0 |
| 23.08.2022 06:00 - 07:00 | 0 | 0 | 0 | 0 |
| 23.08.2022 07:00 - 08:00 | 0 | 0 | 0 | 0 |
| 23.08.2022 08:00 - 09:00 | 0 | 0 | 0 | 0 |
| 23.08.2022 09:00 - 10:00 | 0 | 0 | 0 | 0 |
| 23.08.2022 10:00 - 11:00 | 0 | 0 | 0 | 0 |
| 23.08.2022 11:00 - 12:00 | 0 | 0 | 0 | 0 |
| 23.08.2022 12:00 - 13:00 | 0 | 0 | 0 | 0 |
| 23.08.2022 13:00 - 14:00 | 0 | 0 | 0 | 0 |
| 23.08.2022 14:00 - 15:00 | 0 | 0 | 0 | 0 |
| 23.08.2022 15:00 - 16:00 | 0 | 0 | 0 | 0 |
| 23.08.2022 16:00 - 17:00 | 0 | 0 | 0 | 0 |
| 23.08.2022 17:00 - 18:00 | 0 | 0 | 0 | 0 |
| 23.08.2022 18:00 - 19:00 | 0 | 0 | 0 | 0 |
| 23.08.2022 19:00 - 20:00 | 0 | 0 | 0 | 0 |
| 23.08.2022 20:00 - 21:00 | 0 | 0 | 0 | 0 |
| 23.08.2022 21:00 - 22:00 | 0 | 0 | 0 | 0 |
| 23.08.2022 22:00 - 23:00 | 0 | 0 | 0 | 0 |
| 23.08.2022 23:00 - 24:00 | 0 | 0 | 0 | 0 |
| 24.08.2022 00:00 - 01:00 | 0 | 0 | 0 | 0 |
| 24.08.2022 01:00 - 02:00 | 0 | 0 | 0 | 0 |
| 24.08.2022 02:00 - 03:00 | 0 | 0 | 0 | 0 |
| 24.08.2022 03:00 - 04:00 | 0 | 0 | 0 | 0 |
| 24.08.2022 04:00 - 05:00 | 0 | 0 | 0 | 0 |
| 24.08.2022 05:00 - 06:00 | 0 | 0 | 0 | 0 |
| 24.08.2022 06:00 - 07:00 | 0 | 0 | 0 | 0 |
| 24.08.2022 07:00 - 08:00 | 0 | 0 | 0 | 0 |
| 24.08.2022 08:00 - 09:00 | 0 | 0 | 0 | 0 |
| 24.08.2022 09:00 - 10:00 | 0 | 0 | 0 | 0 |
| 24.08.2022 10:00 - 11:00 | 0 | 0 | 0 | 0 |
| 24.08.2022 11:00 - 12:00 | 0 | 0 | 0 | 0 |
| 24.08.2022 12:00 - 13:00 | 0 | 0 | 0 | 0 |
| 24.08.2022 13:00 - 14:00 | 0 | 0 | 0 | 0 |
| 24.08.2022 14:00 - 15:00 | 0 | 0 | 0 | 0 |
| 24.08.2022 15:00 - 16:00 | 0 | 0 | 0 | 0 |
| 24.08.2022 16:00 - 17:00 | 0 | 0 | 0 | 0 |
| 24.08.2022 17:00 - 18:00 | 0 | 0 | 0 | 0 |
| 24.08.2022 18:00 - 19:00 | 0 | 0 | 0 | 0 |
| 24.08.2022 19:00 - 20:00 | 0 | 0 | 0 | 0 |
| 24.08.2022 20:00 - 21:00 | 0 | 0 | 0 | 0 |
| 24.08.2022 21:00 - 22:00 | 0 | 0 | 0 | 0 |
| 24.08.2022 22:00 - 23:00 | 0 | 0 | 0 | 0 |
| 24.08.2022 23:00 - 24:00 | 0 | 0 | 0 | 0 |
| 25.08.2022 00:00 - 01:00 | 0 | 0 | 0 | 0 |
| 25.08.2022 01:00 - 02:00 | 0 | 0 | 0 | 0 |
| 25.08.2022 02:00 - 03:00 | 0 | 0 | 0 | 0 |
| 25.08.2022 03:00 - 04:00 | 0 | 0 | 0 | 0 |
| 25.08.2022 04:00 - 05:00 | 0 | 0 | 0 | 0 |
| 25.08.2022 05:00 - 06:00 | 0 | 0 | 0 | 0 |
| 25.08.2022 06:00 - 07:00 | 0 | 0 | 0 | 0 |
| 25.08.2022 07:00 - 08:00 | 0 | 0 | 0 | 0 |
| 25.08.2022 08:00 - 09:00 | 0 | 0 | 0 | 0 |
| 25.08.2022 09:00 - 10:00 | 0 | 0 | 0 | 0 |
| 25.08.2022 10:00 - 11:00 | 0 | 0 | 0 | 0 |
| 25.08.2022 11:00 - 12:00 | 0 | 0 | 0 | 0 |
| 25.08.2022 12:00 - 13:00 | 0 | 0 | 0 | 0 |
| 25.08.2022 13:00 - 14:00 | 0 | 0 | 0 | 0 |
| 25.08.2022 14:00 - 15:00 | 0 | 0 | 0 | 0 |
| 25.08.2022 15:00 - 16:00 | 0 | 0 | 0 | 0 |
| 25.08.2022 16:00 - 17:00 | 0 | 0 | 0 | 0 |
| 25.08.2022 17:00 - 18:00 | 0 | 0 | 0 | 0 |
| 25.08.2022 18:00 - 19:00 | 0 | 0 | 0 | 0 |
| 25.08.2022 19:00 - 20:00 | 0 | 0 | 0 | 0 |
| 25.08.2022 20:00 - 21:00 | 0 | 0 | 0 | 0 |
| 25.08.2022 21:00 - 22:00 | 0 | 0 | 0 | 0 |
| 25.08.2022 22:00 - 23:00 | 0 | 0 | 0 | 0 |
| 25.08.2022 23:00 - 24:00 | 0 | 0 | 0 | 0 |
| 26.08.2022 00:00 - 01:00 | 0 | 0 | 0 | 0 |
| 26.08.2022 01:00 - 02:00 | 0 | 0 | 0 | 0 |
| 26.08.2022 02:00 - 03:00 | 0 | 0 | 0 | 0 |
| 26.08.2022 03:00 - 04:00 | 0 | 0 | 0 | 0 |
| 26.08.2022 04:00 - 05:00 | 0 | 0 | 0 | 0 |
| 26.08.2022 05:00 - 06:00 | 0 | 0 | 0 | 0 |
| 26.08.2022 06:00 - 07:00 | 0 | 0 | 0 | 0 |
| 26.08.2022 07:00 - 08:00 | 0 | 0 | 0 | 0 |
| 26.08.2022 08:00 - 09:00 | 0 | 0 | 0 | 0 |
| 26.08.2022 09:00 - 10:00 | 0 | 0 | 0 | 0 |
| 26.08.2022 10:00 - 11:00 | 0 | 0 | 0 | 0 |
| 26.08.2022 11:00 - 12:00 | 0 | 0 | 0 | 0 |
| 26.08.2022 12:00 - 13:00 | 0 | 0 | 0 | 0 |
| 26.08.2022 13:00 - 14:00 | 0 | 0 | 0 | 0 |
| 26.08.2022 14:00 - 15:00 | 0 | 0 | 0 | 0 |
| 26.08.2022 15:00 - 16:00 | 0 | 0 | 0 | 0 |
| 26.08.2022 16:00 - 17:00 | 0 | 0 | 0 | 0 |
| 26.08.2022 17:00 - 18:00 | 0 | 0 | 0 | 0 |
| 26.08.2022 18:00 - 19:00 | 0 | 0 | 0 | 0 |
| 26.08.2022 19:00 - 20:00 | 0 | 0 | 0 | 0 |
| 26.08.2022 20:00 - 21:00 | 0 | 0 | 0 | 0 |
| 26.08.2022 21:00 - 22:00 | 0 | 0 | 0 | 0 |
| 26.08.2022 22:00 - 23:00 | 0 | 0 | 0 | 0 |
| 26.08.2022 23:00 - 24:00 | 0 | 0 | 0 | 0 |
| 27.08.2022 00:00 - 01:00 | 0 | 0 | 0 | 0 |
| 27.08.2022 01:00 - 02:00 | 0 | 0 | 0 | 0 |
| 27.08.2022 02:00 - 03:00 | 0 | 0 | 0 | 0 |
| 27.08.2022 03:00 - 04:00 | 0 | 0 | 0 | 0 |
| 27.08.2022 04:00 - 05:00 | 0 | 0 | 0 | 0 |
| 27.08.2022 05:00 - 06:00 | 0 | 0 | 0 | 0 |
| 27.08.2022 06:00 - 07:00 | 0 | 0 | 0 | 0 |
| 27.08.2022 07:00 - 08:00 | 0 | 0 | 0 | 0 |
| 27.08.2022 08:00 - 09:00 | 0 | 0 | 0 | 0 |
| 27.08.2022 09:00 - 10:00 | 0 | 0 | 0 | 0 |
| 27.08.2022 10:00 - 11:00 | 0 | 0 | 0 | 0 |
| 27.08.2022 11:00 - 12:00 | 0 | 0 | 0 | 0 |
| 27.08.2022 12:00 - 13:00 | 0 | 0 | 0 | 0 |
| 27.08.2022 13:00 - 14:00 | 0 | 0 | 0 | 0 |
| 27.08.2022 14:00 - 15:00 | 0 | 0 | 0 | 0 |
| 27.08.2022 15:00 - 16:00 | 0 | 0 | 0 | 0 |
| 27.08.2022 16:00 - 17:00 | 0 | 0 | 0 | 0 |
| 27.08.2022 17:00 - 18:00 | 0 | 0 | 0 | 0 |
| 27.08.2022 18:00 - 19:00 | 0 | 0 | 0 | 0 |
| 27.08.2022 19:00 - 20:00 | 0 | 0 | 0 | 0 |
| 27.08.2022 20:00 - 21:00 | 0 | 0 | 0 | 0 |
| 27.08.2022 21:00 - 22:00 | 0 | 0 | 0 | 0 |
| 27.08.2022 22:00 - 23:00 | 0 | 0 | 0 | 0 |
| 27.08.2022 23:00 - 24:00 | 0 | 0 | 0 | 0 |
| 28.08.2022 00:00 - 01:00 | 0 | 0 | 0 | 0 |
| 28.08.2022 01:00 - 02:00 | 0 | 0 | 0 | 0 |
| 28.08.2022 02:00 - 03:00 | 0 | 0 | 0 | 0 |
| 28.08.2022 03:00 - 04:00 | 0 | 0 | 0 | 0 |
| 28.08.2022 04:00 - 05:00 | 0 | 0 | 0 | 0 |
| 28.08.2022 05:00 - 06:00 | 0 | 0 | 0 | 0 |
| 28.08.2022 06:00 - 07:00 | 0 | 0 | 0 | 0 |
| 28.08.2022 07:00 - 08:00 | 0 | 0 | 0 | 0 |
| 28.08.2022 08:00 - 09:00 | 0 | 0 | 0 | 0 |
| 28.08.2022 09:00 - 10:00 | 0 | 0 | 0 | 0 |
| 28.08.2022 10:00 - 11:00 | 0 | 0 | 0 | 0 |
| 28.08.2022 11:00 - 12:00 | 0 | 0 | 0 | 0 |
| 28.08.2022 12:00 - 13:00 | 0 | 0 | 0 | 0 |
| 28.08.2022 13:00 - 14:00 | 0 | 0 | 0 | 0 |
| 28.08.2022 14:00 - 15:00 | 0 | 0 | 0 | 0 |
| 28.08.2022 15:00 - 16:00 | 0 | 0 | 0 | 0 |
| 28.08.2022 16:00 - 17:00 | 0 | 0 | 0 | 0 |
| 28.08.2022 17:00 - 18:00 | 0 | 0 | 0 | 0 |
| 28.08.2022 18:00 - 19:00 | 0 | 0 | 0 | 0 |
| 28.08.2022 19:00 - 20:00 | 0 | 0 | 0 | 0 |
| 28.08.2022 20:00 - 21:00 | 0 | 0 | 0 | 0 |
| 28.08.2022 21:00 - 22:00 | 0 | 0 | 0 | 0 |
| 28.08.2022 22:00 - 23:00 | 0 | 0 | 0 | 0 |
| 28.08.2022 23:00 - 24:00 | 0 | 0 | 0 | 0 |
| 29.08.2022 00:00 - 01:00 | 0 | 0 | 0 | 0 |
| 29.08.2022 01:00 - 02:00 | 0 | 0 | 0 | 0 |
| 29.08.2022 02:00 - 03:00 | 0 | 0 | 0 | 0 |
| 29.08.2022 03:00 - 04:00 | 0 | 0 | 0 | 0 |
| 29.08.2022 04:00 - 05:00 | 0 | 0 | 0 | 0 |
| 29.08.2022 05:00 - 06:00 | 0 | 0 | 0 | 0 |
| 29.08.2022 06:00 - 07:00 | 0 | 0 | 0 | 0 |
| 29.08.2022 07:00 - 08:00 | 0 | 0 | 0 | 0 |
| 29.08.2022 08:00 - 09:00 | 0 | 0 | 0 | 0 |
| 29.08.2022 09:00 - 10:00 | 0 | 0 | 0 | 0 |
| 29.08.2022 10:00 - 11:00 | 0 | 0 | 0 | 0 |
| 29.08.2022 11:00 - 12:00 | 0 | 0 | 0 | 0 |
| 29.08.2022 12:00 - 13:00 | 0 | 0 | 0 | 0 |
| 29.08.2022 13:00 - 14:00 | 0 | 0 | 0 | 0 |
| 29.08.2022 14:00 - 15:00 | 0 | 0 | 0 | 0 |
| 29.08.2022 15:00 - 16:00 | 0 | 0 | 0 | 0 |
| 29.08.2022 16:00 - 17:00 | 0 | 0 | 0 | 0 |
| 29.08.2022 17:00 - 18:00 | 0 | 0 | 0 | 0 |
| 29.08.2022 18:00 - 19:00 | 0 | 0 | 0 | 0 |
| 29.08.2022 19:00 - 20:00 | 0 | 0 | 0 | 0 |
| 29.08.2022 20:00 - 21:00 | 0 | 0 | 0 | 0 |
| 29.08.2022 21:00 - 22:00 | 0 | 0 | 0 | 0 |
| 29.08.2022 22:00 - 23:00 | 0 | 0 | 0 | 0 |
| 29.08.2022 23:00 - 24:00 | 0 | 0 | 0 | 0 |
| 30.08.2022 00:00 - 01:00 | 0 | 0 | 0 | 0 |
| 30.08.2022 01:00 - 02:00 | 0 | 0 | 0 | 0 |
| 30.08.2022 02:00 - 03:00 | 0 | 0 | 0 | 0 |
| 30.08.2022 03:00 - 04:00 | 0 | 0 | 0 | 0 |
| 30.08.2022 04:00 - 05:00 | 0 | 0 | 0 | 0 |
| 30.08.2022 05:00 - 06:00 | 0 | 0 | 0 | 0 |
| 30.08.2022 06:00 - 07:00 | 0 | 0 | 0 | 0 |
| 30.08.2022 07:00 - 08:00 | 0 | 0 | 0 | 0 |
| 30.08.2022 08:00 - 09:00 | 0 | 0 | 0 | 0 |
| 30.08.2022 09:00 - 10:00 | 0 | 0 | 0 | 0 |
| 30.08.2022 10:00 - 11:00 | 0 | 0 | 0 | 0 |
| 30.08.2022 11:00 - 12:00 | 0 | 0 | 0 | 0 |
| 30.08.2022 12:00 - 13:00 | 0 | 0 | 0 | 0 |
| 30.08.2022 13:00 - 14:00 | 0 | 0 | 0 | 0 |
| 30.08.2022 14:00 - 15:00 | 0 | 0 | 0 | 0 |
| 30.08.2022 15:00 - 16:00 | 0 | 0 | 0 | 0 |
| 30.08.2022 16:00 - 17:00 | 0 | 0 | 0 | 0 |
| 30.08.2022 17:00 - 18:00 | 0 | 0 | 0 | 0 |
| 30.08.2022 18:00 - 19:00 | 0 | 0 | 0 | 0 |
| 30.08.2022 19:00 - 20:00 | 0 | 0 | 0 | 0 |
| 30.08.2022 20:00 - 21:00 | 0 | 0 | 0 | 0 |
| 30.08.2022 21:00 - 22:00 | 0 | 0 | 0 | 0 |
| 30.08.2022 22:00 - 23:00 | 0 | 0 | 0 | 0 |
| 30.08.2022 23:00 - 24:00 | 0 | 0 | 0 | 0 |
| 31.08.2022 00:00 - 01:00 | 0 | 0 | 0 | 0 |
| 31.08.2022 01:00 - 02:00 | 0 | 0 | 0 | 0 |
| 31.08.2022 02:00 - 03:00 | 0 | 0 | 0 | 0 |
| 31.08.2022 03:00 - 04:00 | 0 | 0 | 0 | 0 |
| 31.08.2022 04:00 - 05:00 | 0 | 0 | 0 | 0 |
| 31.08.2022 05:00 - 06:00 | 0 | 0 | 0 | 0 |
| 31.08.2022 06:00 - 07:00 | 0 | 0 | 0 | 0 |
| 31.08.2022 07:00 - 08:00 | 0 | 0 | 0 | 0 |
| 31.08.2022 08:00 - 09:00 | 0 | 0 | 0 | 0 |
| 31.08.2022 09:00 - 10:00 | 0 | 0 | 0 | 0 |
| 31.08.2022 10:00 - 11:00 | 0 | 0 | 0 | 0 |
| 31.08.2022 11:00 - 12:00 | 0 | 0 | 0 | 0 |
| 31.08.2022 12:00 - 13:00 | 0 | 0 | 0 | 0 |
| 31.08.2022 13:00 - 14:00 | 0 | 0 | 0 | 0 |
| 31.08.2022 14:00 - 15:00 | 0 | 0 | 0 | 0 |
| 31.08.2022 15:00 - 16:00 | 0 | 0 | 0 | 0 |
| 31.08.2022 16:00 - 17:00 | 0 | 0 | 0 | 0 |
| 31.08.2022 17:00 - 18:00 | 0 | 0 | 0 | 0 |
| 31.08.2022 18:00 - 19:00 | 0 | 0 | 0 | 0 |
| 31.08.2022 19:00 - 20:00 | 0 | 0 | 0 | 0 |
| 31.08.2022 20:00 - 21:00 | 0 | 0 | 0 | 0 |
| 31.08.2022 21:00 - 22:00 | 0 | 0 | 0 | 0 |
| 31.08.2022 22:00 - 23:00 | 0 | 0 | 0 | 0 |
| 31.08.2022 23:00 - 24:00 | 0 | 0 | 0 | 0 |
| 01.09.2022 00:00 - 01:00 | 0 | 0 | 0 | 0 |
| 01.09.2022 01:00 - 02:00 | 0 | 0 | 0 | 0 |
| 01.09.2022 02:00 - 03:00 | 0 | 0 | 0 | 0 |
| 01.09.2022 03:00 - 04:00 | 0 | 0 | 0 | 0 |
| 01.09.2022 04:00 - 05:00 | 0 | 0 | 0 | 0 |
| 01.09.2022 05:00 - 06:00 | 0 | 0 | 0 | 0 |